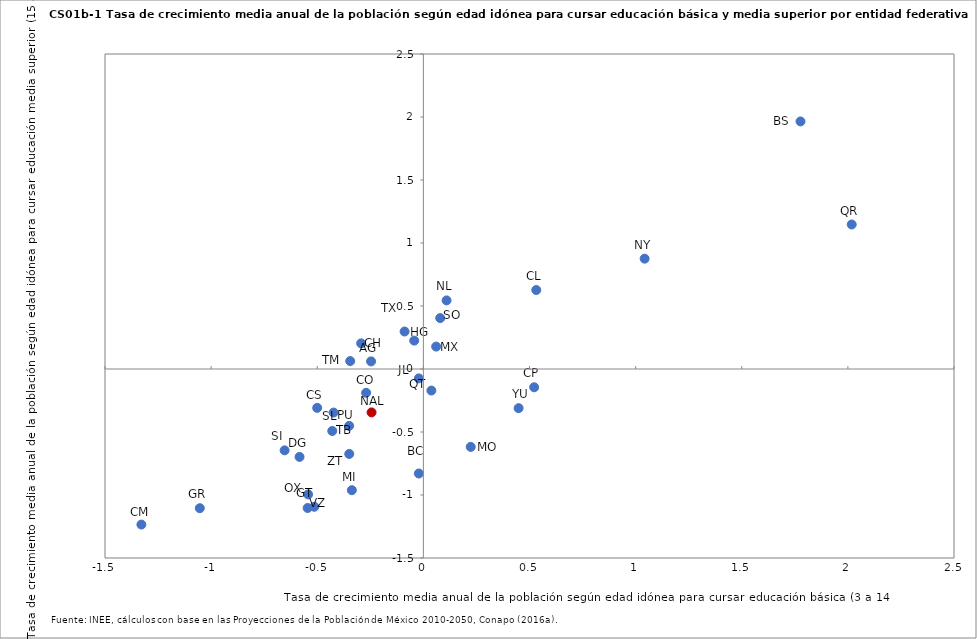
| Category | Series 0 |
|---|---|
| -0.2464712540018208 | 0.06 |
| -0.021292228736603067 | -0.829 |
| 1.7767478594629487 | 1.965 |
| 0.5219306122583434 | -0.145 |
| -0.26965013444140223 | -0.189 |
| 0.5320306985345815 | 0.627 |
| -0.5002773595135619 | -0.308 |
| -0.29327468491659053 | 0.204 |
| -1.3285099399802036 | -1.235 |
| -0.5834605212884514 | -0.698 |
| -0.5138180832201337 | -1.093 |
| -1.0533585206238365 | -1.105 |
| -0.08851227220499347 | 0.297 |
| -0.02146818857217617 | -0.074 |
| 0.06010126455554579 | 0.178 |
| -0.3369880443379005 | -0.962 |
| 0.22305766470438834 | -0.618 |
| 1.0424518073639797 | 0.876 |
| 0.10929071464834479 | 0.545 |
| -0.542991965457508 | -0.995 |
| -0.3496756525277005 | -0.451 |
| 0.03765772275652834 | -0.171 |
| 2.0180971856798067 | 1.147 |
| -0.4292353897030173 | -0.492 |
| -0.6537476685974489 | -0.646 |
| 0.07937111598682782 | 0.404 |
| -0.42300359167250073 | -0.346 |
| -0.34470600218526265 | 0.063 |
| -0.04322086984825166 | 0.225 |
| -0.5453163535843834 | -1.103 |
| 0.4486875705551003 | -0.311 |
| -0.34917234773688477 | -0.674 |
| -0.24413387662286684 | -0.345 |